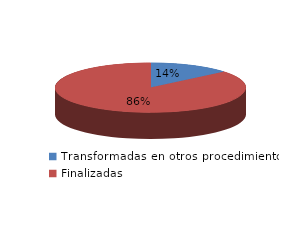
| Category | Series 0 |
|---|---|
| Transformadas en otros procedimientos | 5433 |
| Finalizadas | 33860 |